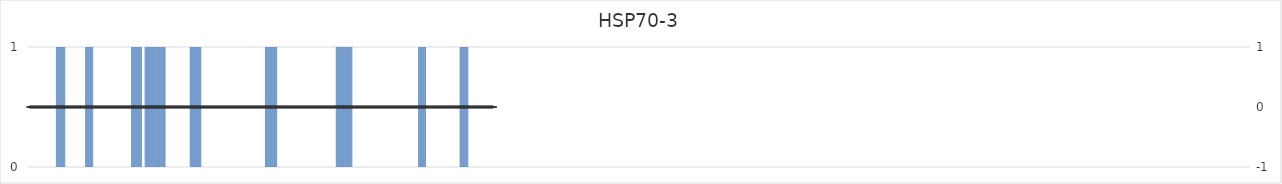
| Category | HSP70-3 |
|---|---|
| 1.0 | 0 |
| 2.0 | 0 |
| 3.0 | 0 |
| 4.0 | 0 |
| 5.0 | 0 |
| 6.0 | 0 |
| 7.0 | 0 |
| 8.0 | 0 |
| 9.0 | 0 |
| 10.0 | 0 |
| 11.0 | 0 |
| 12.0 | 0 |
| 13.0 | 0 |
| 14.0 | 0 |
| 15.0 | 0 |
| 16.0 | 0 |
| 17.0 | 0 |
| 18.0 | 0 |
| 19.0 | 0 |
| 20.0 | 0 |
| 21.0 | 0 |
| 22.0 | 0 |
| 23.0 | 0 |
| 24.0 | 0 |
| 25.0 | 0 |
| 26.0 | 0 |
| 27.0 | 0 |
| 28.0 | 0 |
| 29.0 | 0 |
| 30.0 | 0 |
| 31.0 | 0 |
| 32.0 | 0 |
| 33.0 | 0 |
| 34.0 | 0 |
| 35.0 | 0 |
| 36.0 | 0 |
| 37.0 | 0 |
| 38.0 | 0 |
| 39.0 | 0 |
| 40.0 | 1 |
| 41.0 | 1 |
| 42.0 | 1 |
| 43.0 | 1 |
| 44.0 | 1 |
| 45.0 | 1 |
| 46.0 | 1 |
| 47.0 | 1 |
| 48.0 | 1 |
| 49.0 | 1 |
| 50.0 | 1 |
| 51.0 | 1 |
| 52.0 | 1 |
| 53.0 | 0 |
| 54.0 | 0 |
| 55.0 | 0 |
| 56.0 | 0 |
| 57.0 | 0 |
| 58.0 | 0 |
| 59.0 | 0 |
| 60.0 | 0 |
| 61.0 | 0 |
| 62.0 | 0 |
| 63.0 | 0 |
| 64.0 | 0 |
| 65.0 | 0 |
| 66.0 | 0 |
| 67.0 | 0 |
| 68.0 | 0 |
| 69.0 | 0 |
| 70.0 | 0 |
| 71.0 | 0 |
| 72.0 | 0 |
| 73.0 | 0 |
| 74.0 | 0 |
| 75.0 | 0 |
| 76.0 | 0 |
| 77.0 | 0 |
| 78.0 | 0 |
| 79.0 | 0 |
| 80.0 | 0 |
| 81.0 | 1 |
| 82.0 | 1 |
| 83.0 | 1 |
| 84.0 | 1 |
| 85.0 | 1 |
| 86.0 | 1 |
| 87.0 | 1 |
| 88.0 | 1 |
| 89.0 | 1 |
| 90.0 | 1 |
| 91.0 | 1 |
| 92.0 | 0 |
| 93.0 | 0 |
| 94.0 | 0 |
| 95.0 | 0 |
| 96.0 | 0 |
| 97.0 | 0 |
| 98.0 | 0 |
| 99.0 | 0 |
| 100.0 | 0 |
| 101.0 | 0 |
| 102.0 | 0 |
| 103.0 | 0 |
| 104.0 | 0 |
| 105.0 | 0 |
| 106.0 | 0 |
| 107.0 | 0 |
| 108.0 | 0 |
| 109.0 | 0 |
| 110.0 | 0 |
| 111.0 | 0 |
| 112.0 | 0 |
| 113.0 | 0 |
| 114.0 | 0 |
| 115.0 | 0 |
| 116.0 | 0 |
| 117.0 | 0 |
| 118.0 | 0 |
| 119.0 | 0 |
| 120.0 | 0 |
| 121.0 | 0 |
| 122.0 | 0 |
| 123.0 | 0 |
| 124.0 | 0 |
| 125.0 | 0 |
| 126.0 | 0 |
| 127.0 | 0 |
| 128.0 | 0 |
| 129.0 | 0 |
| 130.0 | 0 |
| 131.0 | 0 |
| 132.0 | 0 |
| 133.0 | 0 |
| 134.0 | 0 |
| 135.0 | 0 |
| 136.0 | 0 |
| 137.0 | 0 |
| 138.0 | 0 |
| 139.0 | 0 |
| 140.0 | 0 |
| 141.0 | 0 |
| 142.0 | 0 |
| 143.0 | 0 |
| 144.0 | 0 |
| 145.0 | 1 |
| 146.0 | 1 |
| 147.0 | 1 |
| 148.0 | 1 |
| 149.0 | 1 |
| 150.0 | 1 |
| 151.0 | 1 |
| 152.0 | 1 |
| 153.0 | 1 |
| 154.0 | 1 |
| 155.0 | 1 |
| 156.0 | 1 |
| 157.0 | 1 |
| 158.0 | 1 |
| 159.0 | 1 |
| 160.0 | 0 |
| 161.0 | 0 |
| 162.0 | 0 |
| 163.0 | 0 |
| 164.0 | 1 |
| 165.0 | 1 |
| 166.0 | 1 |
| 167.0 | 1 |
| 168.0 | 1 |
| 169.0 | 1 |
| 170.0 | 1 |
| 171.0 | 1 |
| 172.0 | 1 |
| 173.0 | 1 |
| 174.0 | 1 |
| 175.0 | 1 |
| 176.0 | 1 |
| 177.0 | 1 |
| 178.0 | 1 |
| 179.0 | 1 |
| 180.0 | 1 |
| 181.0 | 1 |
| 182.0 | 1 |
| 183.0 | 1 |
| 184.0 | 1 |
| 185.0 | 1 |
| 186.0 | 1 |
| 187.0 | 1 |
| 188.0 | 1 |
| 189.0 | 1 |
| 190.0 | 1 |
| 191.0 | 1 |
| 192.0 | 1 |
| 193.0 | 0 |
| 194.0 | 0 |
| 195.0 | 0 |
| 196.0 | 0 |
| 197.0 | 0 |
| 198.0 | 0 |
| 199.0 | 0 |
| 200.0 | 0 |
| 201.0 | 0 |
| 202.0 | 0 |
| 203.0 | 0 |
| 204.0 | 0 |
| 205.0 | 0 |
| 206.0 | 0 |
| 207.0 | 0 |
| 208.0 | 0 |
| 209.0 | 0 |
| 210.0 | 0 |
| 211.0 | 0 |
| 212.0 | 0 |
| 213.0 | 0 |
| 214.0 | 0 |
| 215.0 | 0 |
| 216.0 | 0 |
| 217.0 | 0 |
| 218.0 | 0 |
| 219.0 | 0 |
| 220.0 | 0 |
| 221.0 | 0 |
| 222.0 | 0 |
| 223.0 | 0 |
| 224.0 | 0 |
| 225.0 | 0 |
| 226.0 | 0 |
| 227.0 | 1 |
| 228.0 | 1 |
| 229.0 | 1 |
| 230.0 | 1 |
| 231.0 | 1 |
| 232.0 | 1 |
| 233.0 | 1 |
| 234.0 | 1 |
| 235.0 | 1 |
| 236.0 | 1 |
| 237.0 | 1 |
| 238.0 | 1 |
| 239.0 | 1 |
| 240.0 | 1 |
| 241.0 | 1 |
| 242.0 | 1 |
| 243.0 | 0 |
| 244.0 | 0 |
| 245.0 | 0 |
| 246.0 | 0 |
| 247.0 | 0 |
| 248.0 | 0 |
| 249.0 | 0 |
| 250.0 | 0 |
| 251.0 | 0 |
| 252.0 | 0 |
| 253.0 | 0 |
| 254.0 | 0 |
| 255.0 | 0 |
| 256.0 | 0 |
| 257.0 | 0 |
| 258.0 | 0 |
| 259.0 | 0 |
| 260.0 | 0 |
| 261.0 | 0 |
| 262.0 | 0 |
| 263.0 | 0 |
| 264.0 | 0 |
| 265.0 | 0 |
| 266.0 | 0 |
| 267.0 | 0 |
| 268.0 | 0 |
| 269.0 | 0 |
| 270.0 | 0 |
| 271.0 | 0 |
| 272.0 | 0 |
| 273.0 | 0 |
| 274.0 | 0 |
| 275.0 | 0 |
| 276.0 | 0 |
| 277.0 | 0 |
| 278.0 | 0 |
| 279.0 | 0 |
| 280.0 | 0 |
| 281.0 | 0 |
| 282.0 | 0 |
| 283.0 | 0 |
| 284.0 | 0 |
| 285.0 | 0 |
| 286.0 | 0 |
| 287.0 | 0 |
| 288.0 | 0 |
| 289.0 | 0 |
| 290.0 | 0 |
| 291.0 | 0 |
| 292.0 | 0 |
| 293.0 | 0 |
| 294.0 | 0 |
| 295.0 | 0 |
| 296.0 | 0 |
| 297.0 | 0 |
| 298.0 | 0 |
| 299.0 | 0 |
| 300.0 | 0 |
| 301.0 | 0 |
| 302.0 | 0 |
| 303.0 | 0 |
| 304.0 | 0 |
| 305.0 | 0 |
| 306.0 | 0 |
| 307.0 | 0 |
| 308.0 | 0 |
| 309.0 | 0 |
| 310.0 | 0 |
| 311.0 | 0 |
| 312.0 | 0 |
| 313.0 | 0 |
| 314.0 | 0 |
| 315.0 | 0 |
| 316.0 | 0 |
| 317.0 | 0 |
| 318.0 | 0 |
| 319.0 | 0 |
| 320.0 | 0 |
| 321.0 | 0 |
| 322.0 | 0 |
| 323.0 | 0 |
| 324.0 | 0 |
| 325.0 | 0 |
| 326.0 | 0 |
| 327.0 | 0 |
| 328.0 | 0 |
| 329.0 | 0 |
| 330.0 | 0 |
| 331.0 | 0 |
| 332.0 | 1 |
| 333.0 | 1 |
| 334.0 | 1 |
| 335.0 | 1 |
| 336.0 | 1 |
| 337.0 | 1 |
| 338.0 | 1 |
| 339.0 | 1 |
| 340.0 | 1 |
| 341.0 | 1 |
| 342.0 | 1 |
| 343.0 | 1 |
| 344.0 | 1 |
| 345.0 | 1 |
| 346.0 | 1 |
| 347.0 | 1 |
| 348.0 | 1 |
| 349.0 | 0 |
| 350.0 | 0 |
| 351.0 | 0 |
| 352.0 | 0 |
| 353.0 | 0 |
| 354.0 | 0 |
| 355.0 | 0 |
| 356.0 | 0 |
| 357.0 | 0 |
| 358.0 | 0 |
| 359.0 | 0 |
| 360.0 | 0 |
| 361.0 | 0 |
| 362.0 | 0 |
| 363.0 | 0 |
| 364.0 | 0 |
| 365.0 | 0 |
| 366.0 | 0 |
| 367.0 | 0 |
| 368.0 | 0 |
| 369.0 | 0 |
| 370.0 | 0 |
| 371.0 | 0 |
| 372.0 | 0 |
| 373.0 | 0 |
| 374.0 | 0 |
| 375.0 | 0 |
| 376.0 | 0 |
| 377.0 | 0 |
| 378.0 | 0 |
| 379.0 | 0 |
| 380.0 | 0 |
| 381.0 | 0 |
| 382.0 | 0 |
| 383.0 | 0 |
| 384.0 | 0 |
| 385.0 | 0 |
| 386.0 | 0 |
| 387.0 | 0 |
| 388.0 | 0 |
| 389.0 | 0 |
| 390.0 | 0 |
| 391.0 | 0 |
| 392.0 | 0 |
| 393.0 | 0 |
| 394.0 | 0 |
| 395.0 | 0 |
| 396.0 | 0 |
| 397.0 | 0 |
| 398.0 | 0 |
| 399.0 | 0 |
| 400.0 | 0 |
| 401.0 | 0 |
| 402.0 | 0 |
| 403.0 | 0 |
| 404.0 | 0 |
| 405.0 | 0 |
| 406.0 | 0 |
| 407.0 | 0 |
| 408.0 | 0 |
| 409.0 | 0 |
| 410.0 | 0 |
| 411.0 | 0 |
| 412.0 | 0 |
| 413.0 | 0 |
| 414.0 | 0 |
| 415.0 | 0 |
| 416.0 | 0 |
| 417.0 | 0 |
| 418.0 | 0 |
| 419.0 | 0 |
| 420.0 | 0 |
| 421.0 | 0 |
| 422.0 | 0 |
| 423.0 | 0 |
| 424.0 | 0 |
| 425.0 | 0 |
| 426.0 | 0 |
| 427.0 | 0 |
| 428.0 | 0 |
| 429.0 | 0 |
| 430.0 | 0 |
| 431.0 | 1 |
| 432.0 | 1 |
| 433.0 | 1 |
| 434.0 | 1 |
| 435.0 | 1 |
| 436.0 | 1 |
| 437.0 | 1 |
| 438.0 | 1 |
| 439.0 | 1 |
| 440.0 | 1 |
| 441.0 | 1 |
| 442.0 | 1 |
| 443.0 | 1 |
| 444.0 | 1 |
| 445.0 | 1 |
| 446.0 | 1 |
| 447.0 | 1 |
| 448.0 | 1 |
| 449.0 | 1 |
| 450.0 | 1 |
| 451.0 | 1 |
| 452.0 | 1 |
| 453.0 | 1 |
| 454.0 | 0 |
| 455.0 | 0 |
| 456.0 | 0 |
| 457.0 | 0 |
| 458.0 | 0 |
| 459.0 | 0 |
| 460.0 | 0 |
| 461.0 | 0 |
| 462.0 | 0 |
| 463.0 | 0 |
| 464.0 | 0 |
| 465.0 | 0 |
| 466.0 | 0 |
| 467.0 | 0 |
| 468.0 | 0 |
| 469.0 | 0 |
| 470.0 | 0 |
| 471.0 | 0 |
| 472.0 | 0 |
| 473.0 | 0 |
| 474.0 | 0 |
| 475.0 | 0 |
| 476.0 | 0 |
| 477.0 | 0 |
| 478.0 | 0 |
| 479.0 | 0 |
| 480.0 | 0 |
| 481.0 | 0 |
| 482.0 | 0 |
| 483.0 | 0 |
| 484.0 | 0 |
| 485.0 | 0 |
| 486.0 | 0 |
| 487.0 | 0 |
| 488.0 | 0 |
| 489.0 | 0 |
| 490.0 | 0 |
| 491.0 | 0 |
| 492.0 | 0 |
| 493.0 | 0 |
| 494.0 | 0 |
| 495.0 | 0 |
| 496.0 | 0 |
| 497.0 | 0 |
| 498.0 | 0 |
| 499.0 | 0 |
| 500.0 | 0 |
| 501.0 | 0 |
| 502.0 | 0 |
| 503.0 | 0 |
| 504.0 | 0 |
| 505.0 | 0 |
| 506.0 | 0 |
| 507.0 | 0 |
| 508.0 | 0 |
| 509.0 | 0 |
| 510.0 | 0 |
| 511.0 | 0 |
| 512.0 | 0 |
| 513.0 | 0 |
| 514.0 | 0 |
| 515.0 | 0 |
| 516.0 | 0 |
| 517.0 | 0 |
| 518.0 | 0 |
| 519.0 | 0 |
| 520.0 | 0 |
| 521.0 | 0 |
| 522.0 | 0 |
| 523.0 | 0 |
| 524.0 | 0 |
| 525.0 | 0 |
| 526.0 | 0 |
| 527.0 | 0 |
| 528.0 | 0 |
| 529.0 | 0 |
| 530.0 | 0 |
| 531.0 | 0 |
| 532.0 | 0 |
| 533.0 | 0 |
| 534.0 | 0 |
| 535.0 | 0 |
| 536.0 | 0 |
| 537.0 | 0 |
| 538.0 | 0 |
| 539.0 | 0 |
| 540.0 | 0 |
| 541.0 | 0 |
| 542.0 | 0 |
| 543.0 | 0 |
| 544.0 | 0 |
| 545.0 | 0 |
| 546.0 | 1 |
| 547.0 | 1 |
| 548.0 | 1 |
| 549.0 | 1 |
| 550.0 | 1 |
| 551.0 | 1 |
| 552.0 | 1 |
| 553.0 | 1 |
| 554.0 | 1 |
| 555.0 | 1 |
| 556.0 | 1 |
| 557.0 | 0 |
| 558.0 | 0 |
| 559.0 | 0 |
| 560.0 | 0 |
| 561.0 | 0 |
| 562.0 | 0 |
| 563.0 | 0 |
| 564.0 | 0 |
| 565.0 | 0 |
| 566.0 | 0 |
| 567.0 | 0 |
| 568.0 | 0 |
| 569.0 | 0 |
| 570.0 | 0 |
| 571.0 | 0 |
| 572.0 | 0 |
| 573.0 | 0 |
| 574.0 | 0 |
| 575.0 | 0 |
| 576.0 | 0 |
| 577.0 | 0 |
| 578.0 | 0 |
| 579.0 | 0 |
| 580.0 | 0 |
| 581.0 | 0 |
| 582.0 | 0 |
| 583.0 | 0 |
| 584.0 | 0 |
| 585.0 | 0 |
| 586.0 | 0 |
| 587.0 | 0 |
| 588.0 | 0 |
| 589.0 | 0 |
| 590.0 | 0 |
| 591.0 | 0 |
| 592.0 | 0 |
| 593.0 | 0 |
| 594.0 | 0 |
| 595.0 | 0 |
| 596.0 | 0 |
| 597.0 | 0 |
| 598.0 | 0 |
| 599.0 | 0 |
| 600.0 | 0 |
| 601.0 | 0 |
| 602.0 | 0 |
| 603.0 | 0 |
| 604.0 | 1 |
| 605.0 | 1 |
| 606.0 | 1 |
| 607.0 | 1 |
| 608.0 | 1 |
| 609.0 | 1 |
| 610.0 | 1 |
| 611.0 | 1 |
| 612.0 | 1 |
| 613.0 | 1 |
| 614.0 | 1 |
| 615.0 | 1 |
| 616.0 | 0 |
| 617.0 | 0 |
| 618.0 | 0 |
| 619.0 | 0 |
| 620.0 | 0 |
| 621.0 | 0 |
| 622.0 | 0 |
| 623.0 | 0 |
| 624.0 | 0 |
| 625.0 | 0 |
| 626.0 | 0 |
| 627.0 | 0 |
| 628.0 | 0 |
| 629.0 | 0 |
| 630.0 | 0 |
| 631.0 | 0 |
| 632.0 | 0 |
| 633.0 | 0 |
| 634.0 | 0 |
| 635.0 | 0 |
| 636.0 | 0 |
| 637.0 | 0 |
| 638.0 | 0 |
| 639.0 | 0 |
| 640.0 | 0 |
| 641.0 | 0 |
| 642.0 | 0 |
| 643.0 | 0 |
| 644.0 | 0 |
| 645.0 | 0 |
| 646.0 | 0 |
| 647.0 | 0 |
| 648.0 | 0 |
| 649.0 | 0 |
| 650.0 | 0 |
| 651.0 | 0 |
| 652.0 | 0 |
| 653.0 | 0 |
| 654.0 | 0 |
| 655.0 | 0 |
| 656.0 | 0 |
| 657.0 | 0 |
| 658.0 | 0 |
| 659.0 | 0 |
| 660.0 | 0 |
| 661.0 | 0 |
| 662.0 | 0 |
| 663.0 | 0 |
| 664.0 | 0 |
| 665.0 | 0 |
| 666.0 | 0 |
| 667.0 | 0 |
| 668.0 | 0 |
| 669.0 | 0 |
| 670.0 | 0 |
| 671.0 | 0 |
| 672.0 | 0 |
| 673.0 | 0 |
| 674.0 | 0 |
| 675.0 | 0 |
| 676.0 | 0 |
| 677.0 | 0 |
| 678.0 | 0 |
| 679.0 | 0 |
| 680.0 | 0 |
| 681.0 | 0 |
| 682.0 | 0 |
| 683.0 | 0 |
| 684.0 | 0 |
| 685.0 | 0 |
| 686.0 | 0 |
| 687.0 | 0 |
| 688.0 | 0 |
| 689.0 | 0 |
| 690.0 | 0 |
| 691.0 | 0 |
| 692.0 | 0 |
| 693.0 | 0 |
| 694.0 | 0 |
| 695.0 | 0 |
| 696.0 | 0 |
| 697.0 | 0 |
| 698.0 | 0 |
| 699.0 | 0 |
| 700.0 | 0 |
| 701.0 | 0 |
| 702.0 | 0 |
| 703.0 | 0 |
| 704.0 | 0 |
| 705.0 | 0 |
| 706.0 | 0 |
| 707.0 | 0 |
| 708.0 | 0 |
| 709.0 | 0 |
| 710.0 | 0 |
| 711.0 | 0 |
| 712.0 | 0 |
| 713.0 | 0 |
| 714.0 | 0 |
| 715.0 | 0 |
| 716.0 | 0 |
| 717.0 | 0 |
| 718.0 | 0 |
| 719.0 | 0 |
| 720.0 | 0 |
| 721.0 | 0 |
| 722.0 | 0 |
| 723.0 | 0 |
| 724.0 | 0 |
| 725.0 | 0 |
| 726.0 | 0 |
| 727.0 | 0 |
| 728.0 | 0 |
| 729.0 | 0 |
| 730.0 | 0 |
| 731.0 | 0 |
| 732.0 | 0 |
| 733.0 | 0 |
| 734.0 | 0 |
| 735.0 | 0 |
| 736.0 | 0 |
| 737.0 | 0 |
| 738.0 | 0 |
| 739.0 | 0 |
| 740.0 | 0 |
| 741.0 | 0 |
| 742.0 | 0 |
| 743.0 | 0 |
| 744.0 | 0 |
| 745.0 | 0 |
| 746.0 | 0 |
| 747.0 | 0 |
| 748.0 | 0 |
| 749.0 | 0 |
| 750.0 | 0 |
| 751.0 | 0 |
| 752.0 | 0 |
| 753.0 | 0 |
| 754.0 | 0 |
| 755.0 | 0 |
| 756.0 | 0 |
| 757.0 | 0 |
| 758.0 | 0 |
| 759.0 | 0 |
| 760.0 | 0 |
| 761.0 | 0 |
| 762.0 | 0 |
| 763.0 | 0 |
| 764.0 | 0 |
| 765.0 | 0 |
| 766.0 | 0 |
| 767.0 | 0 |
| 768.0 | 0 |
| 769.0 | 0 |
| 770.0 | 0 |
| 771.0 | 0 |
| 772.0 | 0 |
| 773.0 | 0 |
| 774.0 | 0 |
| 775.0 | 0 |
| 776.0 | 0 |
| 777.0 | 0 |
| 778.0 | 0 |
| 779.0 | 0 |
| 780.0 | 0 |
| 781.0 | 0 |
| 782.0 | 0 |
| 783.0 | 0 |
| 784.0 | 0 |
| 785.0 | 0 |
| 786.0 | 0 |
| 787.0 | 0 |
| 788.0 | 0 |
| 789.0 | 0 |
| 790.0 | 0 |
| 791.0 | 0 |
| 792.0 | 0 |
| 793.0 | 0 |
| 794.0 | 0 |
| 795.0 | 0 |
| 796.0 | 0 |
| 797.0 | 0 |
| 798.0 | 0 |
| 799.0 | 0 |
| 800.0 | 0 |
| 801.0 | 0 |
| 802.0 | 0 |
| 803.0 | 0 |
| 804.0 | 0 |
| 805.0 | 0 |
| 806.0 | 0 |
| 807.0 | 0 |
| 808.0 | 0 |
| 809.0 | 0 |
| 810.0 | 0 |
| 811.0 | 0 |
| 812.0 | 0 |
| 813.0 | 0 |
| 814.0 | 0 |
| 815.0 | 0 |
| 816.0 | 0 |
| 817.0 | 0 |
| 818.0 | 0 |
| 819.0 | 0 |
| 820.0 | 0 |
| 821.0 | 0 |
| 822.0 | 0 |
| 823.0 | 0 |
| 824.0 | 0 |
| 825.0 | 0 |
| 826.0 | 0 |
| 827.0 | 0 |
| 828.0 | 0 |
| 829.0 | 0 |
| 830.0 | 0 |
| 831.0 | 0 |
| 832.0 | 0 |
| 833.0 | 0 |
| 834.0 | 0 |
| 835.0 | 0 |
| 836.0 | 0 |
| 837.0 | 0 |
| 838.0 | 0 |
| 839.0 | 0 |
| 840.0 | 0 |
| 841.0 | 0 |
| 842.0 | 0 |
| 843.0 | 0 |
| 844.0 | 0 |
| 845.0 | 0 |
| 846.0 | 0 |
| 847.0 | 0 |
| 848.0 | 0 |
| 849.0 | 0 |
| 850.0 | 0 |
| 851.0 | 0 |
| 852.0 | 0 |
| 853.0 | 0 |
| 854.0 | 0 |
| 855.0 | 0 |
| 856.0 | 0 |
| 857.0 | 0 |
| 858.0 | 0 |
| 859.0 | 0 |
| 860.0 | 0 |
| 861.0 | 0 |
| 862.0 | 0 |
| 863.0 | 0 |
| 864.0 | 0 |
| 865.0 | 0 |
| 866.0 | 0 |
| 867.0 | 0 |
| 868.0 | 0 |
| 869.0 | 0 |
| 870.0 | 0 |
| 871.0 | 0 |
| 872.0 | 0 |
| 873.0 | 0 |
| 874.0 | 0 |
| 875.0 | 0 |
| 876.0 | 0 |
| 877.0 | 0 |
| 878.0 | 0 |
| 879.0 | 0 |
| 880.0 | 0 |
| 881.0 | 0 |
| 882.0 | 0 |
| 883.0 | 0 |
| 884.0 | 0 |
| 885.0 | 0 |
| 886.0 | 0 |
| 887.0 | 0 |
| 888.0 | 0 |
| 889.0 | 0 |
| 890.0 | 0 |
| 891.0 | 0 |
| 892.0 | 0 |
| 893.0 | 0 |
| 894.0 | 0 |
| 895.0 | 0 |
| 896.0 | 0 |
| 897.0 | 0 |
| 898.0 | 0 |
| 899.0 | 0 |
| 900.0 | 0 |
| 901.0 | 0 |
| 902.0 | 0 |
| 903.0 | 0 |
| 904.0 | 0 |
| 905.0 | 0 |
| 906.0 | 0 |
| 907.0 | 0 |
| 908.0 | 0 |
| 909.0 | 0 |
| 910.0 | 0 |
| 911.0 | 0 |
| 912.0 | 0 |
| 913.0 | 0 |
| 914.0 | 0 |
| 915.0 | 0 |
| 916.0 | 0 |
| 917.0 | 0 |
| 918.0 | 0 |
| 919.0 | 0 |
| 920.0 | 0 |
| 921.0 | 0 |
| 922.0 | 0 |
| 923.0 | 0 |
| 924.0 | 0 |
| 925.0 | 0 |
| 926.0 | 0 |
| 927.0 | 0 |
| 928.0 | 0 |
| 929.0 | 0 |
| 930.0 | 0 |
| 931.0 | 0 |
| 932.0 | 0 |
| 933.0 | 0 |
| 934.0 | 0 |
| 935.0 | 0 |
| 936.0 | 0 |
| 937.0 | 0 |
| 938.0 | 0 |
| 939.0 | 0 |
| 940.0 | 0 |
| 941.0 | 0 |
| 942.0 | 0 |
| 943.0 | 0 |
| 944.0 | 0 |
| 945.0 | 0 |
| 946.0 | 0 |
| 947.0 | 0 |
| 948.0 | 0 |
| 949.0 | 0 |
| 950.0 | 0 |
| 951.0 | 0 |
| 952.0 | 0 |
| 953.0 | 0 |
| 954.0 | 0 |
| 955.0 | 0 |
| 956.0 | 0 |
| 957.0 | 0 |
| 958.0 | 0 |
| 959.0 | 0 |
| 960.0 | 0 |
| 961.0 | 0 |
| 962.0 | 0 |
| 963.0 | 0 |
| 964.0 | 0 |
| 965.0 | 0 |
| 966.0 | 0 |
| 967.0 | 0 |
| 968.0 | 0 |
| 969.0 | 0 |
| 970.0 | 0 |
| 971.0 | 0 |
| 972.0 | 0 |
| 973.0 | 0 |
| 974.0 | 0 |
| 975.0 | 0 |
| 976.0 | 0 |
| 977.0 | 0 |
| 978.0 | 0 |
| 979.0 | 0 |
| 980.0 | 0 |
| 981.0 | 0 |
| 982.0 | 0 |
| 983.0 | 0 |
| 984.0 | 0 |
| 985.0 | 0 |
| 986.0 | 0 |
| 987.0 | 0 |
| 988.0 | 0 |
| 989.0 | 0 |
| 990.0 | 0 |
| 991.0 | 0 |
| 992.0 | 0 |
| 993.0 | 0 |
| 994.0 | 0 |
| 995.0 | 0 |
| 996.0 | 0 |
| 997.0 | 0 |
| 998.0 | 0 |
| 999.0 | 0 |
| 1000.0 | 0 |
| 1001.0 | 0 |
| 1002.0 | 0 |
| 1003.0 | 0 |
| 1004.0 | 0 |
| 1005.0 | 0 |
| 1006.0 | 0 |
| 1007.0 | 0 |
| 1008.0 | 0 |
| 1009.0 | 0 |
| 1010.0 | 0 |
| 1011.0 | 0 |
| 1012.0 | 0 |
| 1013.0 | 0 |
| 1014.0 | 0 |
| 1015.0 | 0 |
| 1016.0 | 0 |
| 1017.0 | 0 |
| 1018.0 | 0 |
| 1019.0 | 0 |
| 1020.0 | 0 |
| 1021.0 | 0 |
| 1022.0 | 0 |
| 1023.0 | 0 |
| 1024.0 | 0 |
| 1025.0 | 0 |
| 1026.0 | 0 |
| 1027.0 | 0 |
| 1028.0 | 0 |
| 1029.0 | 0 |
| 1030.0 | 0 |
| 1031.0 | 0 |
| 1032.0 | 0 |
| 1033.0 | 0 |
| 1034.0 | 0 |
| 1035.0 | 0 |
| 1036.0 | 0 |
| 1037.0 | 0 |
| 1038.0 | 0 |
| 1039.0 | 0 |
| 1040.0 | 0 |
| 1041.0 | 0 |
| 1042.0 | 0 |
| 1043.0 | 0 |
| 1044.0 | 0 |
| 1045.0 | 0 |
| 1046.0 | 0 |
| 1047.0 | 0 |
| 1048.0 | 0 |
| 1049.0 | 0 |
| 1050.0 | 0 |
| 1051.0 | 0 |
| 1052.0 | 0 |
| 1053.0 | 0 |
| 1054.0 | 0 |
| 1055.0 | 0 |
| 1056.0 | 0 |
| 1057.0 | 0 |
| 1058.0 | 0 |
| 1059.0 | 0 |
| 1060.0 | 0 |
| 1061.0 | 0 |
| 1062.0 | 0 |
| 1063.0 | 0 |
| 1064.0 | 0 |
| 1065.0 | 0 |
| 1066.0 | 0 |
| 1067.0 | 0 |
| 1068.0 | 0 |
| 1069.0 | 0 |
| 1070.0 | 0 |
| 1071.0 | 0 |
| 1072.0 | 0 |
| 1073.0 | 0 |
| 1074.0 | 0 |
| 1075.0 | 0 |
| 1076.0 | 0 |
| 1077.0 | 0 |
| 1078.0 | 0 |
| 1079.0 | 0 |
| 1080.0 | 0 |
| 1081.0 | 0 |
| 1082.0 | 0 |
| 1083.0 | 0 |
| 1084.0 | 0 |
| 1085.0 | 0 |
| 1086.0 | 0 |
| 1087.0 | 0 |
| 1088.0 | 0 |
| 1089.0 | 0 |
| 1090.0 | 0 |
| 1091.0 | 0 |
| 1092.0 | 0 |
| 1093.0 | 0 |
| 1094.0 | 0 |
| 1095.0 | 0 |
| 1096.0 | 0 |
| 1097.0 | 0 |
| 1098.0 | 0 |
| 1099.0 | 0 |
| 1100.0 | 0 |
| 1101.0 | 0 |
| 1102.0 | 0 |
| 1103.0 | 0 |
| 1104.0 | 0 |
| 1105.0 | 0 |
| 1106.0 | 0 |
| 1107.0 | 0 |
| 1108.0 | 0 |
| 1109.0 | 0 |
| 1110.0 | 0 |
| 1111.0 | 0 |
| 1112.0 | 0 |
| 1113.0 | 0 |
| 1114.0 | 0 |
| 1115.0 | 0 |
| 1116.0 | 0 |
| 1117.0 | 0 |
| 1118.0 | 0 |
| 1119.0 | 0 |
| 1120.0 | 0 |
| 1121.0 | 0 |
| 1122.0 | 0 |
| 1123.0 | 0 |
| 1124.0 | 0 |
| 1125.0 | 0 |
| 1126.0 | 0 |
| 1127.0 | 0 |
| 1128.0 | 0 |
| 1129.0 | 0 |
| 1130.0 | 0 |
| 1131.0 | 0 |
| 1132.0 | 0 |
| 1133.0 | 0 |
| 1134.0 | 0 |
| 1135.0 | 0 |
| 1136.0 | 0 |
| 1137.0 | 0 |
| 1138.0 | 0 |
| 1139.0 | 0 |
| 1140.0 | 0 |
| 1141.0 | 0 |
| 1142.0 | 0 |
| 1143.0 | 0 |
| 1144.0 | 0 |
| 1145.0 | 0 |
| 1146.0 | 0 |
| 1147.0 | 0 |
| 1148.0 | 0 |
| 1149.0 | 0 |
| 1150.0 | 0 |
| 1151.0 | 0 |
| 1152.0 | 0 |
| 1153.0 | 0 |
| 1154.0 | 0 |
| 1155.0 | 0 |
| 1156.0 | 0 |
| 1157.0 | 0 |
| 1158.0 | 0 |
| 1159.0 | 0 |
| 1160.0 | 0 |
| 1161.0 | 0 |
| 1162.0 | 0 |
| 1163.0 | 0 |
| 1164.0 | 0 |
| 1165.0 | 0 |
| 1166.0 | 0 |
| 1167.0 | 0 |
| 1168.0 | 0 |
| 1169.0 | 0 |
| 1170.0 | 0 |
| 1171.0 | 0 |
| 1172.0 | 0 |
| 1173.0 | 0 |
| 1174.0 | 0 |
| 1175.0 | 0 |
| 1176.0 | 0 |
| 1177.0 | 0 |
| 1178.0 | 0 |
| 1179.0 | 0 |
| 1180.0 | 0 |
| 1181.0 | 0 |
| 1182.0 | 0 |
| 1183.0 | 0 |
| 1184.0 | 0 |
| 1185.0 | 0 |
| 1186.0 | 0 |
| 1187.0 | 0 |
| 1188.0 | 0 |
| 1189.0 | 0 |
| 1190.0 | 0 |
| 1191.0 | 0 |
| 1192.0 | 0 |
| 1193.0 | 0 |
| 1194.0 | 0 |
| 1195.0 | 0 |
| 1196.0 | 0 |
| 1197.0 | 0 |
| 1198.0 | 0 |
| 1199.0 | 0 |
| 1200.0 | 0 |
| 1201.0 | 0 |
| 1202.0 | 0 |
| 1203.0 | 0 |
| 1204.0 | 0 |
| 1205.0 | 0 |
| 1206.0 | 0 |
| 1207.0 | 0 |
| 1208.0 | 0 |
| 1209.0 | 0 |
| 1210.0 | 0 |
| 1211.0 | 0 |
| 1212.0 | 0 |
| 1213.0 | 0 |
| 1214.0 | 0 |
| 1215.0 | 0 |
| 1216.0 | 0 |
| 1217.0 | 0 |
| 1218.0 | 0 |
| 1219.0 | 0 |
| 1220.0 | 0 |
| 1221.0 | 0 |
| 1222.0 | 0 |
| 1223.0 | 0 |
| 1224.0 | 0 |
| 1225.0 | 0 |
| 1226.0 | 0 |
| 1227.0 | 0 |
| 1228.0 | 0 |
| 1229.0 | 0 |
| 1230.0 | 0 |
| 1231.0 | 0 |
| 1232.0 | 0 |
| 1233.0 | 0 |
| 1234.0 | 0 |
| 1235.0 | 0 |
| 1236.0 | 0 |
| 1237.0 | 0 |
| 1238.0 | 0 |
| 1239.0 | 0 |
| 1240.0 | 0 |
| 1241.0 | 0 |
| 1242.0 | 0 |
| 1243.0 | 0 |
| 1244.0 | 0 |
| 1245.0 | 0 |
| 1246.0 | 0 |
| 1247.0 | 0 |
| 1248.0 | 0 |
| 1249.0 | 0 |
| 1250.0 | 0 |
| 1251.0 | 0 |
| 1252.0 | 0 |
| 1253.0 | 0 |
| 1254.0 | 0 |
| 1255.0 | 0 |
| 1256.0 | 0 |
| 1257.0 | 0 |
| 1258.0 | 0 |
| 1259.0 | 0 |
| 1260.0 | 0 |
| 1261.0 | 0 |
| 1262.0 | 0 |
| 1263.0 | 0 |
| 1264.0 | 0 |
| 1265.0 | 0 |
| 1266.0 | 0 |
| 1267.0 | 0 |
| 1268.0 | 0 |
| 1269.0 | 0 |
| 1270.0 | 0 |
| 1271.0 | 0 |
| 1272.0 | 0 |
| 1273.0 | 0 |
| 1274.0 | 0 |
| 1275.0 | 0 |
| 1276.0 | 0 |
| 1277.0 | 0 |
| 1278.0 | 0 |
| 1279.0 | 0 |
| 1280.0 | 0 |
| 1281.0 | 0 |
| 1282.0 | 0 |
| 1283.0 | 0 |
| 1284.0 | 0 |
| 1285.0 | 0 |
| 1286.0 | 0 |
| 1287.0 | 0 |
| 1288.0 | 0 |
| 1289.0 | 0 |
| 1290.0 | 0 |
| 1291.0 | 0 |
| 1292.0 | 0 |
| 1293.0 | 0 |
| 1294.0 | 0 |
| 1295.0 | 0 |
| 1296.0 | 0 |
| 1297.0 | 0 |
| 1298.0 | 0 |
| 1299.0 | 0 |
| 1300.0 | 0 |
| 1301.0 | 0 |
| 1302.0 | 0 |
| 1303.0 | 0 |
| 1304.0 | 0 |
| 1305.0 | 0 |
| 1306.0 | 0 |
| 1307.0 | 0 |
| 1308.0 | 0 |
| 1309.0 | 0 |
| 1310.0 | 0 |
| 1311.0 | 0 |
| 1312.0 | 0 |
| 1313.0 | 0 |
| 1314.0 | 0 |
| 1315.0 | 0 |
| 1316.0 | 0 |
| 1317.0 | 0 |
| 1318.0 | 0 |
| 1319.0 | 0 |
| 1320.0 | 0 |
| 1321.0 | 0 |
| 1322.0 | 0 |
| 1323.0 | 0 |
| 1324.0 | 0 |
| 1325.0 | 0 |
| 1326.0 | 0 |
| 1327.0 | 0 |
| 1328.0 | 0 |
| 1329.0 | 0 |
| 1330.0 | 0 |
| 1331.0 | 0 |
| 1332.0 | 0 |
| 1333.0 | 0 |
| 1334.0 | 0 |
| 1335.0 | 0 |
| 1336.0 | 0 |
| 1337.0 | 0 |
| 1338.0 | 0 |
| 1339.0 | 0 |
| 1340.0 | 0 |
| 1341.0 | 0 |
| 1342.0 | 0 |
| 1343.0 | 0 |
| 1344.0 | 0 |
| 1345.0 | 0 |
| 1346.0 | 0 |
| 1347.0 | 0 |
| 1348.0 | 0 |
| 1349.0 | 0 |
| 1350.0 | 0 |
| 1351.0 | 0 |
| 1352.0 | 0 |
| 1353.0 | 0 |
| 1354.0 | 0 |
| 1355.0 | 0 |
| 1356.0 | 0 |
| 1357.0 | 0 |
| 1358.0 | 0 |
| 1359.0 | 0 |
| 1360.0 | 0 |
| 1361.0 | 0 |
| 1362.0 | 0 |
| 1363.0 | 0 |
| 1364.0 | 0 |
| 1365.0 | 0 |
| 1366.0 | 0 |
| 1367.0 | 0 |
| 1368.0 | 0 |
| 1369.0 | 0 |
| 1370.0 | 0 |
| 1371.0 | 0 |
| 1372.0 | 0 |
| 1373.0 | 0 |
| 1374.0 | 0 |
| 1375.0 | 0 |
| 1376.0 | 0 |
| 1377.0 | 0 |
| 1378.0 | 0 |
| 1379.0 | 0 |
| 1380.0 | 0 |
| 1381.0 | 0 |
| 1382.0 | 0 |
| 1383.0 | 0 |
| 1384.0 | 0 |
| 1385.0 | 0 |
| 1386.0 | 0 |
| 1387.0 | 0 |
| 1388.0 | 0 |
| 1389.0 | 0 |
| 1390.0 | 0 |
| 1391.0 | 0 |
| 1392.0 | 0 |
| 1393.0 | 0 |
| 1394.0 | 0 |
| 1395.0 | 0 |
| 1396.0 | 0 |
| 1397.0 | 0 |
| 1398.0 | 0 |
| 1399.0 | 0 |
| 1400.0 | 0 |
| 1401.0 | 0 |
| 1402.0 | 0 |
| 1403.0 | 0 |
| 1404.0 | 0 |
| 1405.0 | 0 |
| 1406.0 | 0 |
| 1407.0 | 0 |
| 1408.0 | 0 |
| 1409.0 | 0 |
| 1410.0 | 0 |
| 1411.0 | 0 |
| 1412.0 | 0 |
| 1413.0 | 0 |
| 1414.0 | 0 |
| 1415.0 | 0 |
| 1416.0 | 0 |
| 1417.0 | 0 |
| 1418.0 | 0 |
| 1419.0 | 0 |
| 1420.0 | 0 |
| 1421.0 | 0 |
| 1422.0 | 0 |
| 1423.0 | 0 |
| 1424.0 | 0 |
| 1425.0 | 0 |
| 1426.0 | 0 |
| 1427.0 | 0 |
| 1428.0 | 0 |
| 1429.0 | 0 |
| 1430.0 | 0 |
| 1431.0 | 0 |
| 1432.0 | 0 |
| 1433.0 | 0 |
| 1434.0 | 0 |
| 1435.0 | 0 |
| 1436.0 | 0 |
| 1437.0 | 0 |
| 1438.0 | 0 |
| 1439.0 | 0 |
| 1440.0 | 0 |
| 1441.0 | 0 |
| 1442.0 | 0 |
| 1443.0 | 0 |
| 1444.0 | 0 |
| 1445.0 | 0 |
| 1446.0 | 0 |
| 1447.0 | 0 |
| 1448.0 | 0 |
| 1449.0 | 0 |
| 1450.0 | 0 |
| 1451.0 | 0 |
| 1452.0 | 0 |
| 1453.0 | 0 |
| 1454.0 | 0 |
| 1455.0 | 0 |
| 1456.0 | 0 |
| 1457.0 | 0 |
| 1458.0 | 0 |
| 1459.0 | 0 |
| 1460.0 | 0 |
| 1461.0 | 0 |
| 1462.0 | 0 |
| 1463.0 | 0 |
| 1464.0 | 0 |
| 1465.0 | 0 |
| 1466.0 | 0 |
| 1467.0 | 0 |
| 1468.0 | 0 |
| 1469.0 | 0 |
| 1470.0 | 0 |
| 1471.0 | 0 |
| 1472.0 | 0 |
| 1473.0 | 0 |
| 1474.0 | 0 |
| 1475.0 | 0 |
| 1476.0 | 0 |
| 1477.0 | 0 |
| 1478.0 | 0 |
| 1479.0 | 0 |
| 1480.0 | 0 |
| 1481.0 | 0 |
| 1482.0 | 0 |
| 1483.0 | 0 |
| 1484.0 | 0 |
| 1485.0 | 0 |
| 1486.0 | 0 |
| 1487.0 | 0 |
| 1488.0 | 0 |
| 1489.0 | 0 |
| 1490.0 | 0 |
| 1491.0 | 0 |
| 1492.0 | 0 |
| 1493.0 | 0 |
| 1494.0 | 0 |
| 1495.0 | 0 |
| 1496.0 | 0 |
| 1497.0 | 0 |
| 1498.0 | 0 |
| 1499.0 | 0 |
| 1500.0 | 0 |
| 1501.0 | 0 |
| 1502.0 | 0 |
| 1503.0 | 0 |
| 1504.0 | 0 |
| 1505.0 | 0 |
| 1506.0 | 0 |
| 1507.0 | 0 |
| 1508.0 | 0 |
| 1509.0 | 0 |
| 1510.0 | 0 |
| 1511.0 | 0 |
| 1512.0 | 0 |
| 1513.0 | 0 |
| 1514.0 | 0 |
| 1515.0 | 0 |
| 1516.0 | 0 |
| 1517.0 | 0 |
| 1518.0 | 0 |
| 1519.0 | 0 |
| 1520.0 | 0 |
| 1521.0 | 0 |
| 1522.0 | 0 |
| 1523.0 | 0 |
| 1524.0 | 0 |
| 1525.0 | 0 |
| 1526.0 | 0 |
| 1527.0 | 0 |
| 1528.0 | 0 |
| 1529.0 | 0 |
| 1530.0 | 0 |
| 1531.0 | 0 |
| 1532.0 | 0 |
| 1533.0 | 0 |
| 1534.0 | 0 |
| 1535.0 | 0 |
| 1536.0 | 0 |
| 1537.0 | 0 |
| 1538.0 | 0 |
| 1539.0 | 0 |
| 1540.0 | 0 |
| 1541.0 | 0 |
| 1542.0 | 0 |
| 1543.0 | 0 |
| 1544.0 | 0 |
| 1545.0 | 0 |
| 1546.0 | 0 |
| 1547.0 | 0 |
| 1548.0 | 0 |
| 1549.0 | 0 |
| 1550.0 | 0 |
| 1551.0 | 0 |
| 1552.0 | 0 |
| 1553.0 | 0 |
| 1554.0 | 0 |
| 1555.0 | 0 |
| 1556.0 | 0 |
| 1557.0 | 0 |
| 1558.0 | 0 |
| 1559.0 | 0 |
| 1560.0 | 0 |
| 1561.0 | 0 |
| 1562.0 | 0 |
| 1563.0 | 0 |
| 1564.0 | 0 |
| 1565.0 | 0 |
| 1566.0 | 0 |
| 1567.0 | 0 |
| 1568.0 | 0 |
| 1569.0 | 0 |
| 1570.0 | 0 |
| 1571.0 | 0 |
| 1572.0 | 0 |
| 1573.0 | 0 |
| 1574.0 | 0 |
| 1575.0 | 0 |
| 1576.0 | 0 |
| 1577.0 | 0 |
| 1578.0 | 0 |
| 1579.0 | 0 |
| 1580.0 | 0 |
| 1581.0 | 0 |
| 1582.0 | 0 |
| 1583.0 | 0 |
| 1584.0 | 0 |
| 1585.0 | 0 |
| 1586.0 | 0 |
| 1587.0 | 0 |
| 1588.0 | 0 |
| 1589.0 | 0 |
| 1590.0 | 0 |
| 1591.0 | 0 |
| 1592.0 | 0 |
| 1593.0 | 0 |
| 1594.0 | 0 |
| 1595.0 | 0 |
| 1596.0 | 0 |
| 1597.0 | 0 |
| 1598.0 | 0 |
| 1599.0 | 0 |
| 1600.0 | 0 |
| 1601.0 | 0 |
| 1602.0 | 0 |
| 1603.0 | 0 |
| 1604.0 | 0 |
| 1605.0 | 0 |
| 1606.0 | 0 |
| 1607.0 | 0 |
| 1608.0 | 0 |
| 1609.0 | 0 |
| 1610.0 | 0 |
| 1611.0 | 0 |
| 1612.0 | 0 |
| 1613.0 | 0 |
| 1614.0 | 0 |
| 1615.0 | 0 |
| 1616.0 | 0 |
| 1617.0 | 0 |
| 1618.0 | 0 |
| 1619.0 | 0 |
| 1620.0 | 0 |
| 1621.0 | 0 |
| 1622.0 | 0 |
| 1623.0 | 0 |
| 1624.0 | 0 |
| 1625.0 | 0 |
| 1626.0 | 0 |
| 1627.0 | 0 |
| 1628.0 | 0 |
| 1629.0 | 0 |
| 1630.0 | 0 |
| 1631.0 | 0 |
| 1632.0 | 0 |
| 1633.0 | 0 |
| 1634.0 | 0 |
| 1635.0 | 0 |
| 1636.0 | 0 |
| 1637.0 | 0 |
| 1638.0 | 0 |
| 1639.0 | 0 |
| 1640.0 | 0 |
| 1641.0 | 0 |
| 1642.0 | 0 |
| 1643.0 | 0 |
| 1644.0 | 0 |
| 1645.0 | 0 |
| 1646.0 | 0 |
| 1647.0 | 0 |
| 1648.0 | 0 |
| 1649.0 | 0 |
| 1650.0 | 0 |
| 1651.0 | 0 |
| 1652.0 | 0 |
| 1653.0 | 0 |
| 1654.0 | 0 |
| 1655.0 | 0 |
| 1656.0 | 0 |
| 1657.0 | 0 |
| 1658.0 | 0 |
| 1659.0 | 0 |
| 1660.0 | 0 |
| 1661.0 | 0 |
| 1662.0 | 0 |
| 1663.0 | 0 |
| 1664.0 | 0 |
| 1665.0 | 0 |
| 1666.0 | 0 |
| 1667.0 | 0 |
| 1668.0 | 0 |
| 1669.0 | 0 |
| 1670.0 | 0 |
| 1671.0 | 0 |
| 1672.0 | 0 |
| 1673.0 | 0 |
| 1674.0 | 0 |
| 1675.0 | 0 |
| 1676.0 | 0 |
| 1677.0 | 0 |
| 1678.0 | 0 |
| 1679.0 | 0 |
| 1680.0 | 0 |
| 1681.0 | 0 |
| 1682.0 | 0 |
| 1683.0 | 0 |
| 1684.0 | 0 |
| 1685.0 | 0 |
| 1686.0 | 0 |
| 1687.0 | 0 |
| 1688.0 | 0 |
| 1689.0 | 0 |
| 1690.0 | 0 |
| 1691.0 | 0 |
| 1692.0 | 0 |
| 1693.0 | 0 |
| 1694.0 | 0 |
| 1695.0 | 0 |
| 1696.0 | 0 |
| 1697.0 | 0 |
| 1698.0 | 0 |
| 1699.0 | 0 |
| 1700.0 | 0 |
| 1701.0 | 0 |
| 1702.0 | 0 |
| 1703.0 | 0 |
| 1704.0 | 0 |
| 1705.0 | 0 |
| 1706.0 | 0 |
| 1707.0 | 0 |